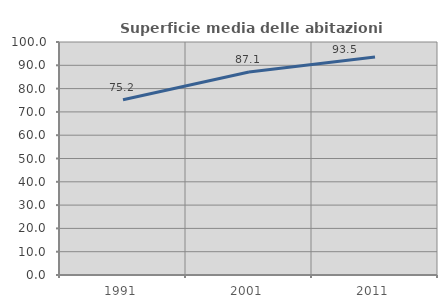
| Category | Superficie media delle abitazioni occupate |
|---|---|
| 1991.0 | 75.177 |
| 2001.0 | 87.143 |
| 2011.0 | 93.525 |